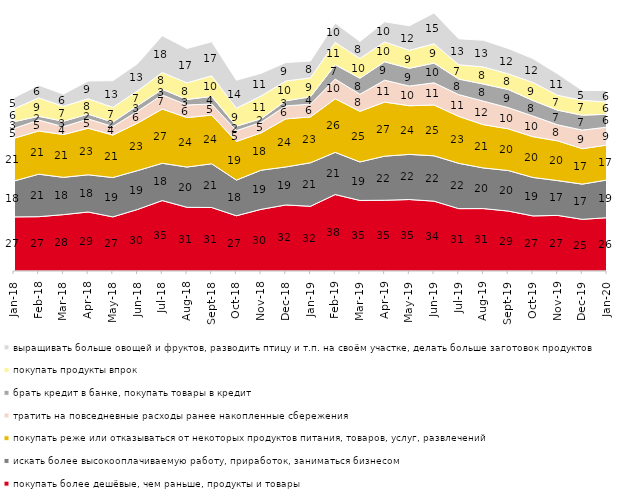
| Category | покупать более дешёвые, чем раньше, продукты и товары | искать более высокооплачиваемую работу, приработок, заниматься бизнесом | покупать реже или отказываться от некоторых продуктов питания, товаров, услуг, развлечений | тратить на повседневные расходы ранее накопленные сбережения | брать кредит в банке, покупать товары в кредит | покупать продукты впрок | выращивать больше овощей и фруктов, разводить птицу и т.п. на своём участке, делать больше заготовок продуктов  |
|---|---|---|---|---|---|---|---|
| 2018-01-01 | 26.55 | 17.6 | 20.95 | 4.85 | 3.3 | 6.35 | 5.45 |
| 2018-02-01 | 26.65 | 20.85 | 21.2 | 5.35 | 1.85 | 9 | 6.25 |
| 2018-03-01 | 27.65 | 18.3 | 21 | 3.85 | 2.65 | 7.35 | 5.95 |
| 2018-04-01 | 28.95 | 18.25 | 22.85 | 4.55 | 2.35 | 7.55 | 8.7 |
| 2018-05-01 | 26.55 | 19.3 | 20.85 | 4.2 | 2.15 | 7.25 | 13.05 |
| 2018-06-01 | 30.2 | 19.05 | 23.3 | 5.8 | 2.8 | 7.2 | 13.35 |
| 2018-07-01 | 34.55 | 18.3 | 26.6 | 6.95 | 2.75 | 8.25 | 18.05 |
| 2018-08-01 | 31.25 | 19.75 | 24.25 | 6.2 | 2.7 | 8.15 | 16.85 |
| 2018-09-01 | 31.15 | 21.45 | 23.9 | 5.45 | 3.7 | 10.1 | 16.7 |
| 2018-10-01 | 27.1 | 17.5 | 18.95 | 5.3 | 2.2 | 8.8 | 13.75 |
| 2018-11-01 | 30.24 | 19.212 | 18.313 | 5.14 | 1.796 | 11.178 | 11.078 |
| 2018-12-01 | 32.4 | 18.65 | 23.6 | 6.35 | 2.5 | 9.7 | 9.05 |
| 2019-01-01 | 31.75 | 21.35 | 22.5 | 6.25 | 3.65 | 9.25 | 8.25 |
| 2019-02-01 | 37.5 | 20.7 | 26.25 | 9.7 | 7.05 | 10.95 | 9.5 |
| 2019-03-01 | 34.61 | 18.896 | 24.814 | 8.404 | 7.857 | 9.697 | 8.354 |
| 2019-04-01 | 34.703 | 21.634 | 26.535 | 10.743 | 9.01 | 9.752 | 9.851 |
| 2019-05-01 | 35.067 | 22.14 | 23.873 | 9.658 | 8.717 | 8.816 | 12.036 |
| 2019-06-01 | 34.264 | 22.244 | 24.938 | 10.873 | 9.676 | 9.476 | 15.112 |
| 2019-07-01 | 30.594 | 22.228 | 23.02 | 10.693 | 7.624 | 7.03 | 12.723 |
| 2019-08-01 | 30.619 | 19.93 | 21.229 | 11.538 | 8.392 | 8.392 | 13.087 |
| 2019-09-01 | 29.406 | 19.901 | 20.446 | 10.396 | 8.911 | 7.673 | 12.426 |
| 2019-10-01 | 27.03 | 18.861 | 20 | 10.149 | 7.624 | 8.861 | 11.683 |
| 2019-11-01 | 27.277 | 17.079 | 19.505 | 7.871 | 7.178 | 7.277 | 10.545 |
| 2019-12-01 | 25.347 | 17.277 | 17.376 | 9.109 | 7.327 | 7.277 | 4.851 |
| 2020-01-01 | 26.139 | 18.515 | 17.129 | 8.812 | 6.287 | 6.04 | 5.594 |